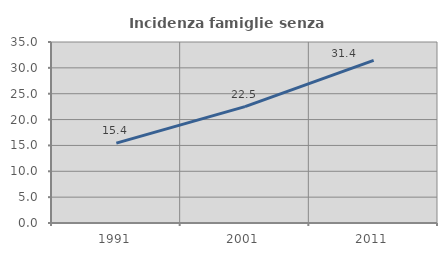
| Category | Incidenza famiglie senza nuclei |
|---|---|
| 1991.0 | 15.44 |
| 2001.0 | 22.512 |
| 2011.0 | 31.433 |